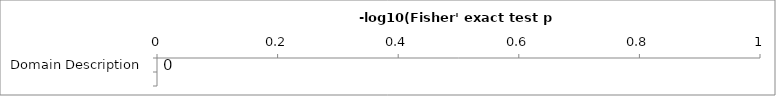
| Category | Series 0 |
|---|---|
| Domain Description | 0 |